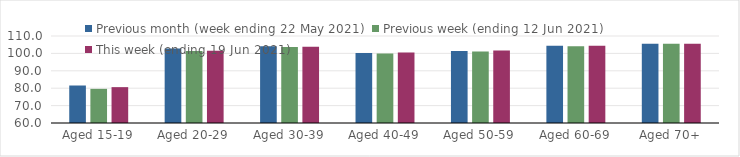
| Category | Previous month (week ending 22 May 2021) | Previous week (ending 12 Jun 2021) | This week (ending 19 Jun 2021) |
|---|---|---|---|
| Aged 15-19 | 81.55 | 79.63 | 80.61 |
| Aged 20-29 | 102.8 | 101.31 | 101.56 |
| Aged 30-39 | 104.16 | 103.73 | 103.78 |
| Aged 40-49 | 100.18 | 99.93 | 100.58 |
| Aged 50-59 | 101.45 | 101.12 | 101.72 |
| Aged 60-69 | 104.45 | 104.16 | 104.39 |
| Aged 70+ | 105.59 | 105.54 | 105.53 |